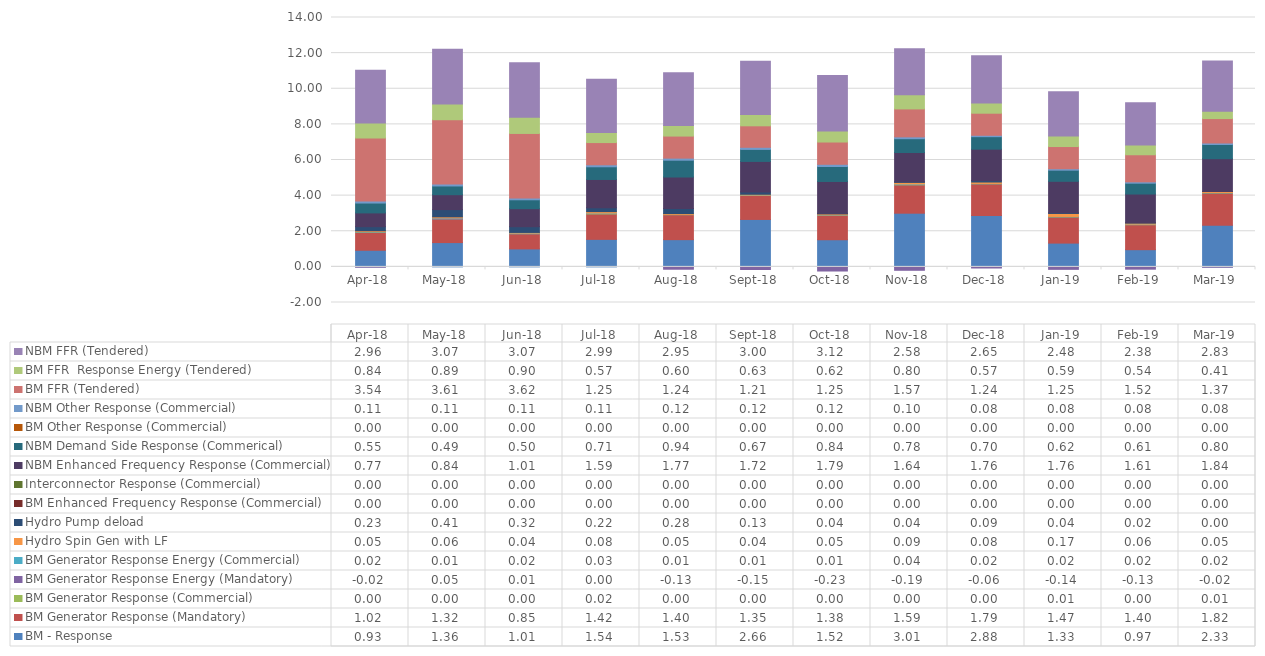
| Category | BM - Response | BM Generator Response (Mandatory)  | BM Generator Response (Commercial) | BM Generator Response Energy (Mandatory)  | BM Generator Response Energy (Commercial)  | Hydro Spin Gen with LF | Hydro Pump deload | BM Enhanced Frequency Response (Commercial) | Interconnector Response (Commercial) | NBM Enhanced Frequency Response (Commercial) | NBM Demand Side Response (Commerical) | BM Other Response (Commercial) | NBM Other Response (Commercial) | BM FFR (Tendered) | BM FFR  Response Energy (Tendered) | NBM FFR (Tendered) |
|---|---|---|---|---|---|---|---|---|---|---|---|---|---|---|---|---|
| 2018-04-30 | 0.933 | 1.017 | 0.004 | -0.018 | 0.024 | 0.049 | 0.229 | 0 | 0 | 0.774 | 0.553 | 0 | 0.114 | 3.537 | 0.841 | 2.963 |
| 2018-05-31 | 1.364 | 1.316 | 0.002 | 0.053 | 0.013 | 0.059 | 0.406 | 0 | 0 | 0.839 | 0.489 | 0 | 0.113 | 3.605 | 0.887 | 3.065 |
| 2018-06-30 | 1.008 | 0.848 | 0.003 | 0.012 | 0.022 | 0.039 | 0.322 | 0 | 0 | 1.011 | 0.5 | 0 | 0.107 | 3.617 | 0.905 | 3.065 |
| 2018-07-31 | 1.545 | 1.423 | 0.022 | 0.003 | 0.027 | 0.081 | 0.217 | 0 | 0 | 1.589 | 0.712 | 0 | 0.112 | 1.247 | 0.572 | 2.988 |
| 2018-08-31 | 1.529 | 1.402 | 0.003 | -0.132 | 0.009 | 0.048 | 0.283 | 0 | 0 | 1.771 | 0.943 | 0 | 0.117 | 1.238 | 0.596 | 2.954 |
| 2018-09-30 | 2.663 | 1.354 | 0.002 | -0.149 | 0.014 | 0.043 | 0.128 | 0 | 0 | 1.717 | 0.674 | 0 | 0.119 | 1.205 | 0.631 | 2.998 |
| 2018-10-31 | 1.523 | 1.385 | 0.001 | -0.232 | 0.013 | 0.05 | 0.035 | 0 | 0 | 1.787 | 0.841 | 0 | 0.123 | 1.251 | 0.622 | 3.116 |
| 2018-11-30 | 3.014 | 1.595 | 0.003 | -0.192 | 0.04 | 0.09 | 0.038 | 0 | 0 | 1.64 | 0.775 | 0 | 0.104 | 1.568 | 0.798 | 2.585 |
| 2018-12-31 | 2.879 | 1.786 | 0.002 | -0.063 | 0.018 | 0.079 | 0.088 | 0 | 0 | 1.757 | 0.701 | 0 | 0.078 | 1.238 | 0.569 | 2.654 |
| 2019-01-31 | 1.334 | 1.469 | 0.008 | -0.139 | 0.019 | 0.168 | 0.042 | 0 | 0 | 1.764 | 0.624 | 0 | 0.081 | 1.245 | 0.589 | 2.485 |
| 2019-02-28 | 0.965 | 1.403 | 0.004 | -0.13 | 0.023 | 0.062 | 0.021 | 0 | 0 | 1.611 | 0.608 | 0 | 0.077 | 1.52 | 0.542 | 2.375 |
| 2019-03-31 | 2.333 | 1.818 | 0.007 | -0.017 | 0.018 | 0.054 | 0.002 | 0 | 0 | 1.842 | 0.797 | 0 | 0.085 | 1.37 | 0.408 | 2.829 |